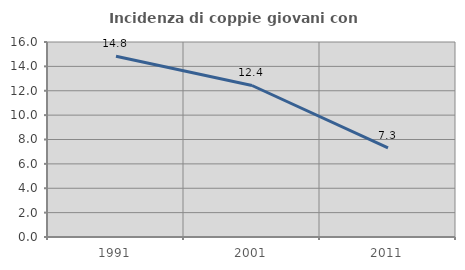
| Category | Incidenza di coppie giovani con figli |
|---|---|
| 1991.0 | 14.835 |
| 2001.0 | 12.431 |
| 2011.0 | 7.321 |